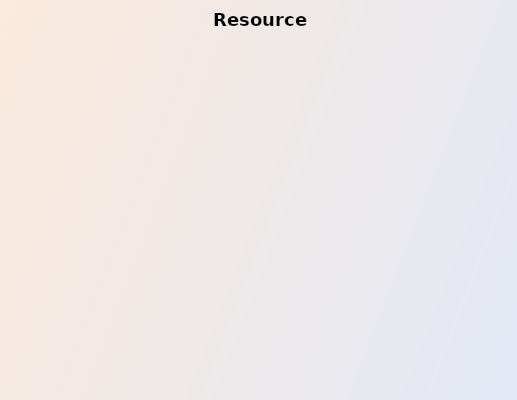
| Category | Series 0 |
|---|---|
| Resource Mobilization Planning and Implementation | 2 |
| Resource Diversification | 2 |
| Resource Monitoring | 3 |